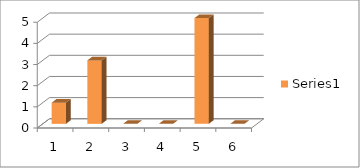
| Category | Series 0 |
|---|---|
| 0 | 1 |
| 1 | 3 |
| 2 | 0 |
| 3 | 0 |
| 4 | 5 |
| 5 | 0 |